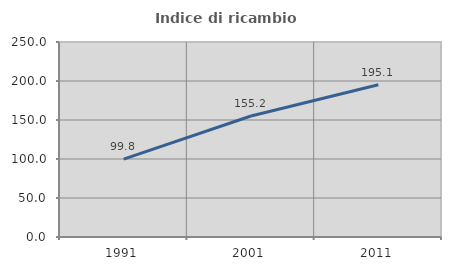
| Category | Indice di ricambio occupazionale  |
|---|---|
| 1991.0 | 99.767 |
| 2001.0 | 155.158 |
| 2011.0 | 195.132 |